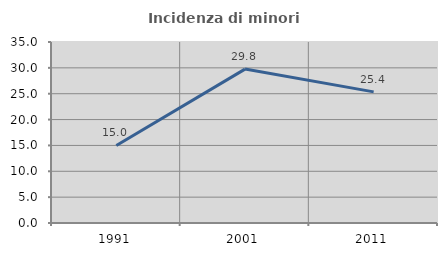
| Category | Incidenza di minori stranieri |
|---|---|
| 1991.0 | 15 |
| 2001.0 | 29.762 |
| 2011.0 | 25.359 |